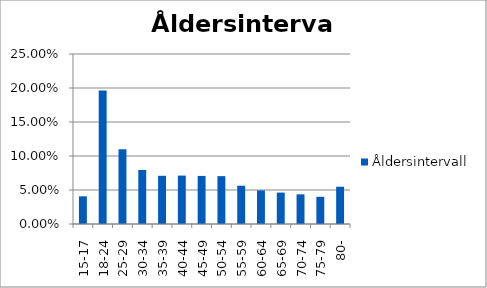
| Category | Åldersintervall |
|---|---|
| 15-17 | 0.041 |
| 18-24 | 0.196 |
| 25-29 | 0.11 |
| 30-34 | 0.08 |
| 35-39 | 0.071 |
| 40-44 | 0.071 |
| 45-49 | 0.071 |
| 50-54 | 0.07 |
| 55-59 | 0.056 |
| 60-64 | 0.049 |
| 65-69 | 0.046 |
| 70-74 | 0.044 |
| 75-79 | 0.04 |
| 80- | 0.055 |